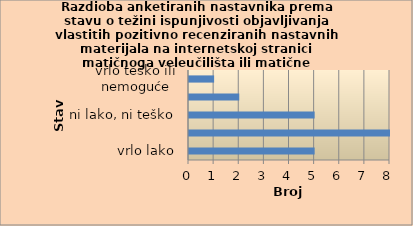
| Category | Series 0 |
|---|---|
| vrlo lako | 5 |
| lako | 8 |
| ni lako, ni teško | 5 |
| teško | 2 |
| vrlo teško ili nemoguće | 1 |